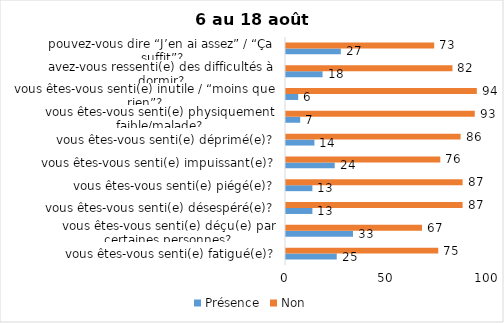
| Category | Présence | Non |
|---|---|---|
| vous êtes-vous senti(e) fatigué(e)? | 25 | 75 |
| vous êtes-vous senti(e) déçu(e) par certaines personnes? | 33 | 67 |
| vous êtes-vous senti(e) désespéré(e)? | 13 | 87 |
| vous êtes-vous senti(e) piégé(e)? | 13 | 87 |
| vous êtes-vous senti(e) impuissant(e)? | 24 | 76 |
| vous êtes-vous senti(e) déprimé(e)? | 14 | 86 |
| vous êtes-vous senti(e) physiquement faible/malade? | 7 | 93 |
| vous êtes-vous senti(e) inutile / “moins que rien”? | 6 | 94 |
| avez-vous ressenti(e) des difficultés à dormir? | 18 | 82 |
| pouvez-vous dire “J’en ai assez” / “Ça suffit”? | 27 | 73 |